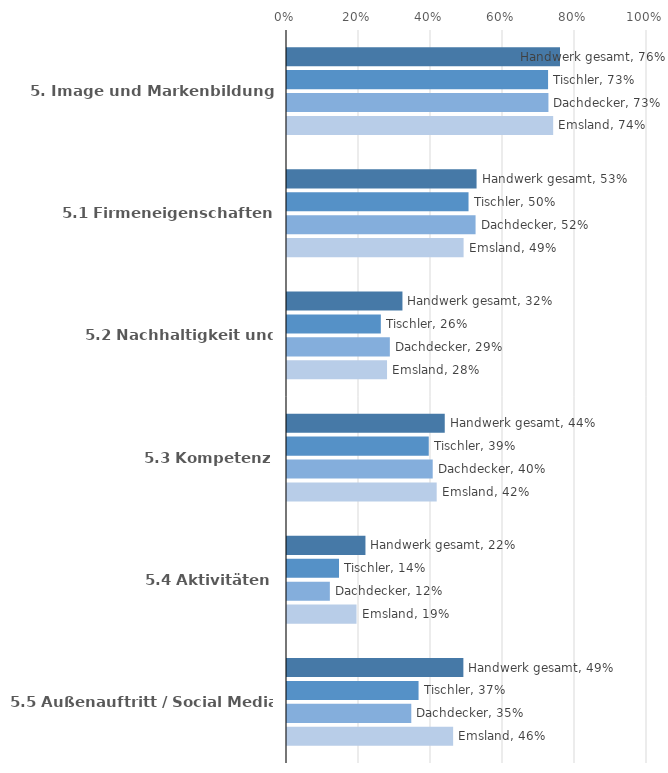
| Category | Handwerk gesamt | Tischler | Dachdecker | Emsland |
|---|---|---|---|---|
| 5. Image und Markenbildung | 0.758 | 0.725 | 0.726 | 0.739 |
| 5.1 Firmeneigenschaften | 0.527 | 0.504 | 0.524 | 0.491 |
| 5.2 Nachhaltigkeit und Compliance | 0.321 | 0.261 | 0.286 | 0.278 |
| 5.3 Kompetenz | 0.438 | 0.394 | 0.405 | 0.416 |
| 5.4 Aktivitäten | 0.218 | 0.144 | 0.119 | 0.193 |
| 5.5 Außenauftritt / Social Media | 0.49 | 0.365 | 0.345 | 0.461 |